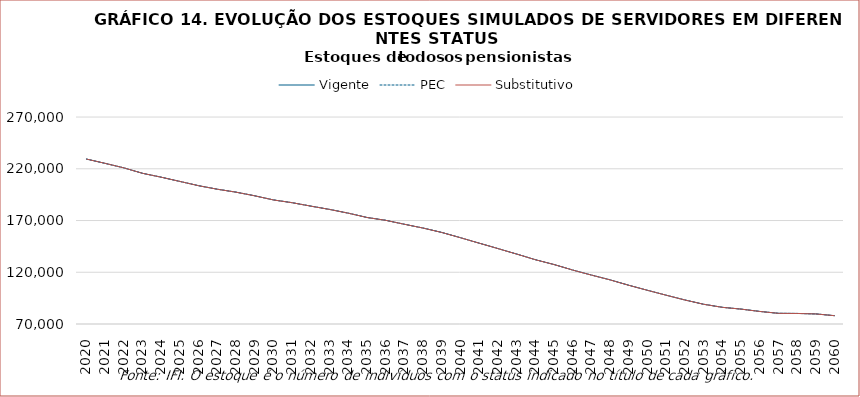
| Category | Vigente | PEC | Substitutivo |
|---|---|---|---|
| 2020.0 | 229404 | 229400 | 229394 |
| 2021.0 | 225269 | 225268 | 225261 |
| 2022.0 | 220919 | 220913 | 220910 |
| 2023.0 | 215653 | 215651 | 215643 |
| 2024.0 | 211869 | 211871 | 211859 |
| 2025.0 | 207786 | 207785 | 207775 |
| 2026.0 | 203661 | 203657 | 203643 |
| 2027.0 | 200255 | 200255 | 200234 |
| 2028.0 | 197413 | 197416 | 197393 |
| 2029.0 | 193897 | 193905 | 193874 |
| 2030.0 | 189906 | 189915 | 189874 |
| 2031.0 | 187230 | 187244 | 187207 |
| 2032.0 | 183916 | 183928 | 183890 |
| 2033.0 | 180737 | 180745 | 180707 |
| 2034.0 | 177127 | 177132 | 177093 |
| 2035.0 | 172953 | 172952 | 172916 |
| 2036.0 | 170215 | 170220 | 170182 |
| 2037.0 | 166394 | 166401 | 166356 |
| 2038.0 | 162722 | 162735 | 162686 |
| 2039.0 | 158484 | 158503 | 158448 |
| 2040.0 | 153374 | 153388 | 153340 |
| 2041.0 | 148134 | 148145 | 148090 |
| 2042.0 | 142913 | 142916 | 142869 |
| 2043.0 | 137625 | 137623 | 137577 |
| 2044.0 | 132161 | 132164 | 132120 |
| 2045.0 | 127488 | 127495 | 127445 |
| 2046.0 | 122123 | 122137 | 122080 |
| 2047.0 | 117310 | 117312 | 117247 |
| 2048.0 | 112663 | 112661 | 112609 |
| 2049.0 | 107409 | 107400 | 107363 |
| 2050.0 | 102543 | 102516 | 102499 |
| 2051.0 | 97813 | 97801 | 97776 |
| 2052.0 | 93203 | 93168 | 93149 |
| 2053.0 | 89098 | 89059 | 89037 |
| 2054.0 | 86130 | 86102 | 86079 |
| 2055.0 | 84420 | 84376 | 84367 |
| 2056.0 | 82165 | 82122 | 82096 |
| 2057.0 | 80337 | 80294 | 80289 |
| 2058.0 | 80209 | 80184 | 80168 |
| 2059.0 | 79750 | 79730 | 79714 |
| 2060.0 | 78059 | 78013 | 78024 |